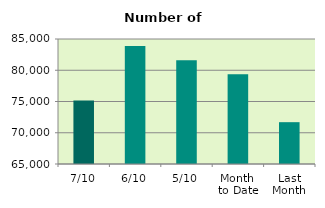
| Category | Series 0 |
|---|---|
| 7/10 | 75166 |
| 6/10 | 83880 |
| 5/10 | 81586 |
| Month 
to Date | 79362.4 |
| Last
Month | 71692 |